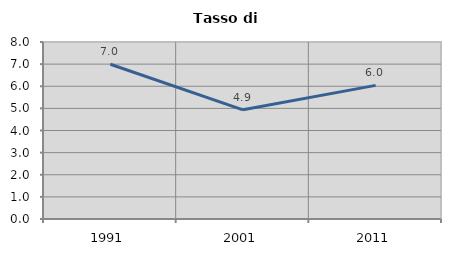
| Category | Tasso di disoccupazione   |
|---|---|
| 1991.0 | 6.994 |
| 2001.0 | 4.936 |
| 2011.0 | 6.04 |